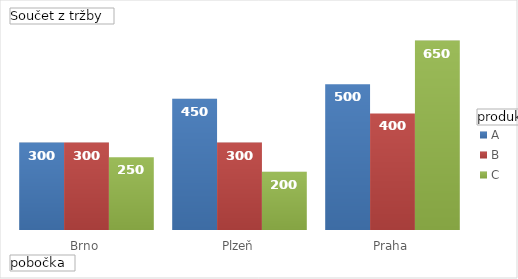
| Category | A | B | C |
|---|---|---|---|
| Brno | 300 | 300 | 250 |
| Plzeň | 450 | 300 | 200 |
| Praha | 500 | 400 | 650 |